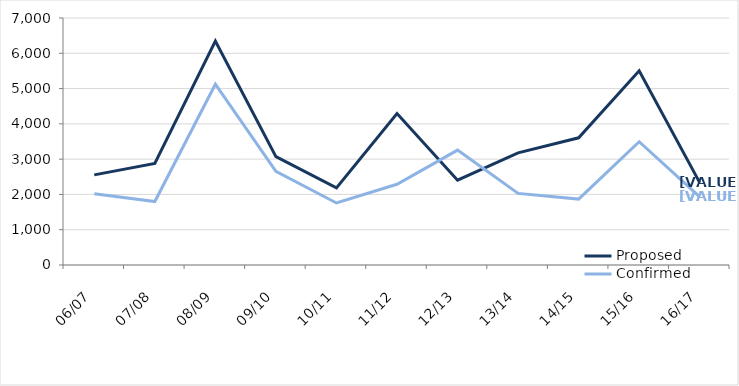
| Category | Proposed | Confirmed |
|---|---|---|
| 06/07 | 2554 | 2017 |
| 07/08 | 2879 | 1798 |
| 08/09 | 6345 | 5123 |
| 09/10 | 3071 | 2653 |
| 10/11 | 2184 | 1758 |
| 11/12 | 4294 | 2288 |
| 12/13 | 2403 | 3257 |
| 13/14 | 3178 | 2029 |
| 14/15 | 3605 | 1868 |
| 15/16 | 5503 | 3493 |
| 16/17 | 2335 | 1932 |